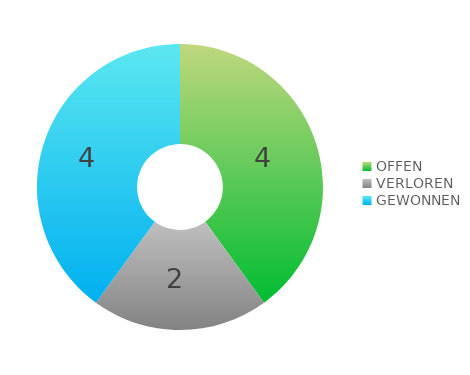
| Category | Series 0 |
|---|---|
| OFFEN | 4 |
| VERLOREN | 2 |
| GEWONNEN | 4 |